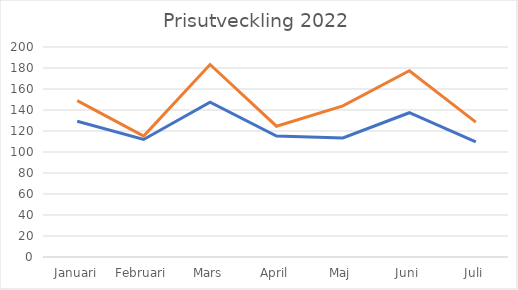
| Category | Series 0 | Series 1 |
|---|---|---|
| Januari | 129.31 | 148.9 |
| Februari | 111.94 | 115.17 |
| Mars | 147.36 | 183.31 |
| April | 115.16 | 124.58 |
| Maj | 113.41 | 143.87 |
| Juni | 137.4 | 177.39 |
| Juli | 109.65 | 128.49 |